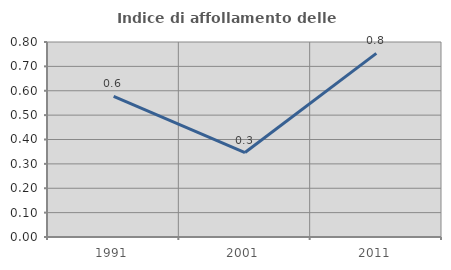
| Category | Indice di affollamento delle abitazioni  |
|---|---|
| 1991.0 | 0.577 |
| 2001.0 | 0.347 |
| 2011.0 | 0.753 |